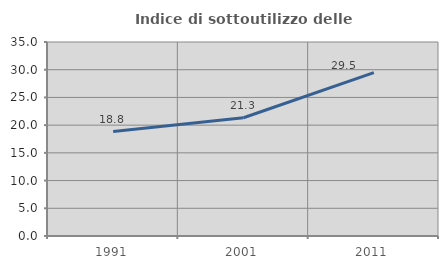
| Category | Indice di sottoutilizzo delle abitazioni  |
|---|---|
| 1991.0 | 18.835 |
| 2001.0 | 21.338 |
| 2011.0 | 29.485 |